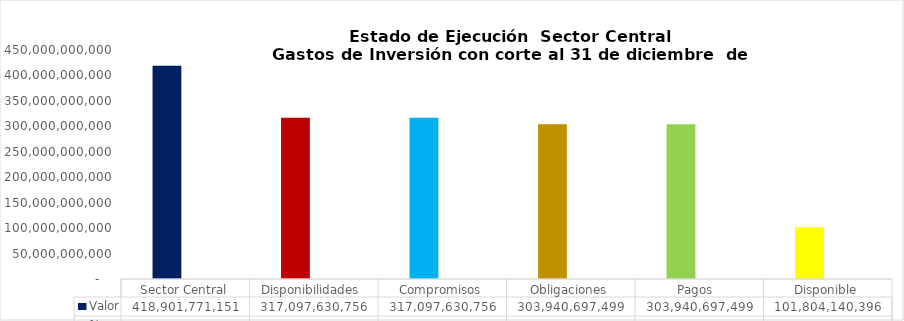
| Category | Valor | % |
|---|---|---|
| Sector Central | 418901771151.37 | 1 |
| Disponibilidades  | 317097630755.74 | 0.757 |
| Compromisos | 317097630755.74 | 0.757 |
| Obligaciones | 303940697499.46 | 0.726 |
| Pagos  | 303940697499.46 | 0.726 |
|  Disponible  | 101804140395.63 | 0.243 |